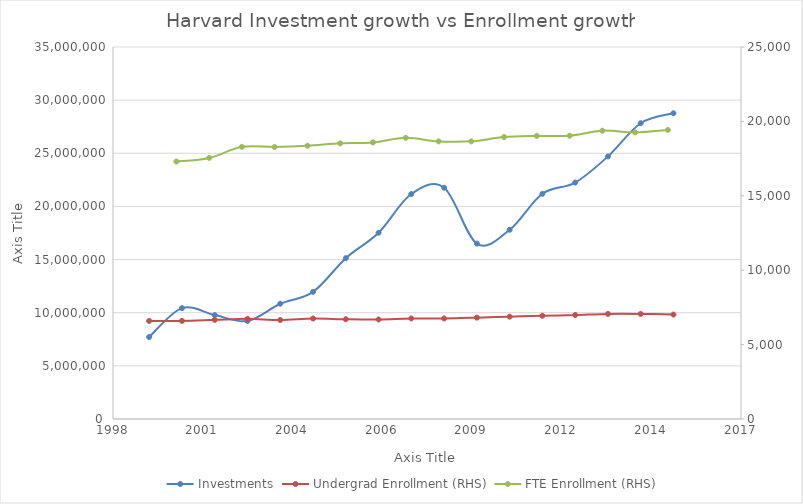
| Category | Investments |
|---|---|
| 42247.0 | 28766000 |
| 41882.0 | 27828590 |
| 41517.0 | 24703407 |
| 41152.0 | 22246700 |
| 40786.0 | 21189487 |
| 40421.0 | 17803361 |
| 40056.0 | 16500670 |
| 39691.0 | 21757716 |
| 39325.0 | 21167073 |
| 38960.0 | 17524666 |
| 38595.0 | 15131630 |
| 38230.0 | 11963733 |
| 37864.0 | 10841586 |
| 37499.0 | 9221048 |
| 37134.0 | 9774970 |
| 36769.0 | 10432886 |
| 36403.0 | 7714334 |